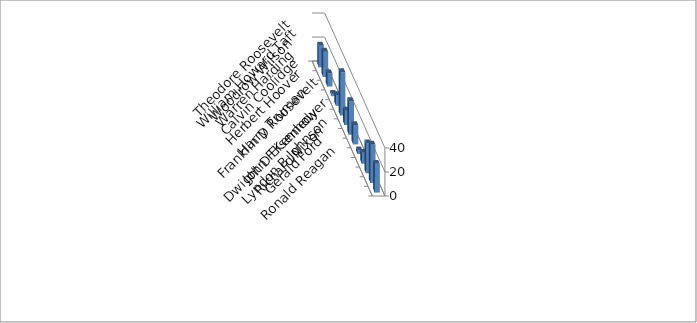
| Category | Series 0 |
|---|---|
| Theodore Roosevelt | 18 |
| William Howard Taft | 21 |
| Woodrow Wilson | 11 |
| Warren Harding | 2 |
| Calvin Coolidge | 9 |
| Herbert Hoover | 36 |
| Franklin D Roosevelt | 12 |
| Harry Truman | 28 |
| Dwight D Eisenhower | 16 |
| John F Kennedy | 3 |
| Lyndon B Johnson | 9 |
| Richard Nixon | 25 |
| Gerald Ford | 32 |
| Ronald Reagan | 24 |